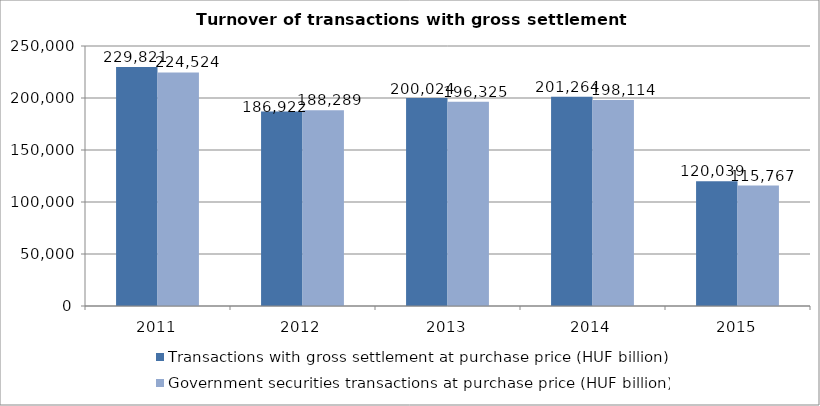
| Category | Transactions with gross settlement at purchase price (HUF billion) | Government securities transactions at purchase price (HUF billion) |
|---|---|---|
| 2011.0 | 229821 | 224524 |
| 2012.0 | 186922 | 188289 |
| 2013.0 | 200024 | 196325 |
| 2014.0 | 201264 | 198114 |
| 2015.0 | 120039 | 115767 |